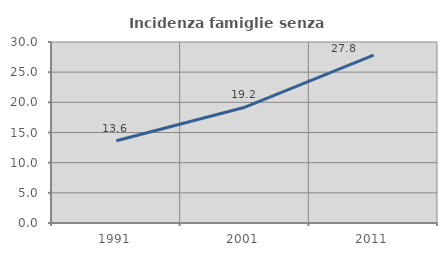
| Category | Incidenza famiglie senza nuclei |
|---|---|
| 1991.0 | 13.621 |
| 2001.0 | 19.188 |
| 2011.0 | 27.841 |